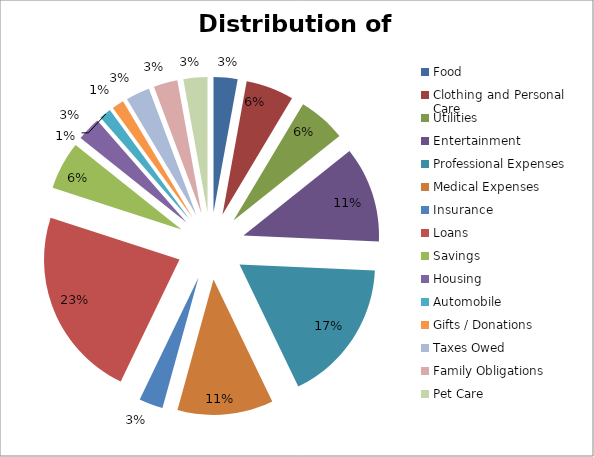
| Category | Series 0 |
|---|---|
| Food | 50 |
| Clothing and Personal Care | 100 |
| Utilities | 100 |
| Entertainment | 200 |
| Professional Expenses | 300 |
| Medical Expenses | 200 |
| Insurance | 50 |
| Loans | 400 |
| Savings | 100 |
| Housing | 50 |
| Automobile | 25 |
| Gifts / Donations | 25 |
| Taxes Owed | 50 |
| Family Obligations | 50 |
| Pet Care | 50 |